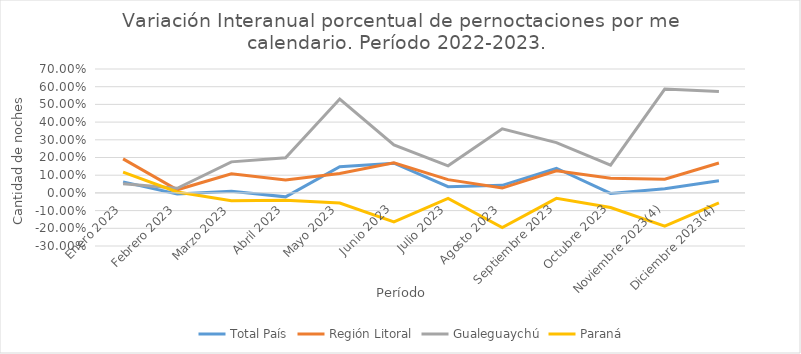
| Category | Total País | Región Litoral | Gualeguaychú | Paraná |
|---|---|---|---|---|
| Enero 2023 | 0.062 | 0.192 | 0.052 | 0.117 |
| Febrero 2023 | -0.006 | 0.018 | 0.026 | 0.005 |
| Marzo 2023 | 0.01 | 0.108 | 0.175 | -0.044 |
| Abril 2023 | -0.022 | 0.074 | 0.199 | -0.041 |
| Mayo 2023 | 0.148 | 0.11 | 0.53 | -0.057 |
| Junio 2023 | 0.168 | 0.17 | 0.272 | -0.164 |
| Julio 2023 | 0.035 | 0.075 | 0.153 | -0.031 |
| Agosto 2023 | 0.043 | 0.027 | 0.362 | -0.196 |
| Septiembre 2023 | 0.139 | 0.125 | 0.284 | -0.031 |
| Octubre 2023 | -0.003 | 0.083 | 0.157 | -0.083 |
| Noviembre 2023(4) | 0.024 | 0.077 | 0.587 | -0.188 |
| Diciembre 2023(4) | 0.069 | 0.169 | 0.572 | -0.056 |